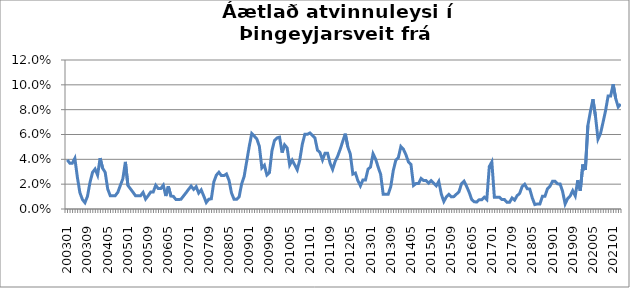
| Category | Series 0 |
|---|---|
| 200301 | 0.04 |
| 200302 | 0.037 |
| 200303 | 0.037 |
| 200304 | 0.041 |
| 200305 | 0.026 |
| 200306 | 0.013 |
| 200307 | 0.008 |
| 200308 | 0.005 |
| 200309 | 0.01 |
| 200310 | 0.021 |
| 200311 | 0.029 |
| 200312 | 0.032 |
| 200401 | 0.027 |
| 200402 | 0.041 |
| 200403 | 0.033 |
| 200404 | 0.03 |
| 200405 | 0.016 |
| 200406 | 0.011 |
| 200407 | 0.011 |
| 200408 | 0.011 |
| 200409 | 0.013 |
| 200410 | 0.019 |
| 200411 | 0.024 |
| 200412 | 0.038 |
| 200501 | 0.019 |
| 200502 | 0.016 |
| 200503 | 0.014 |
| 200504 | 0.011 |
| 200505 | 0.011 |
| 200506 | 0.011 |
| 200507 | 0.013 |
| 200508 | 0.008 |
| 200509 | 0.011 |
| 200510 | 0.014 |
| 200511 | 0.014 |
| 200512 | 0.019 |
| 200601 | 0.016 |
| 200602 | 0.016 |
| 200603 | 0.019 |
| 200604 | 0.01 |
| 200605 | 0.018 |
| 200606 | 0.01 |
| 200607 | 0.01 |
| 200608 | 0.008 |
| 200609 | 0.008 |
| 200610 | 0.008 |
| 200611 | 0.01 |
| 200612 | 0.013 |
| 200701 | 0.016 |
| 200702 | 0.018 |
| 200703 | 0.016 |
| 200704 | 0.018 |
| 200705 | 0.013 |
| 200706 | 0.015 |
| 200707 | 0.01 |
| 200708 | 0.005 |
| 200709 | 0.008 |
| 200710 | 0.008 |
| 200711 | 0.022 |
| 200712 | 0.027 |
| 200801 | 0.03 |
| 200802 | 0.027 |
| 200803 | 0.027 |
| 200804 | 0.028 |
| 200805 | 0.023 |
| 200806 | 0.013 |
| 200807 | 0.008 |
| 200808 | 0.008 |
| 200809 | 0.01 |
| 200810 | 0.02 |
| 200811 | 0.026 |
| 200812 | 0.038 |
| 200901 | 0.05 |
| 200902 | 0.061 |
| 200903 | 0.059 |
| 200904 | 0.056 |
| 200905 | 0.051 |
| 200906 | 0.033 |
| 200907 | 0.035 |
| 200908 | 0.027 |
| 200909 | 0.029 |
| 200910 | 0.047 |
| 200911 | 0.055 |
| 200912 | 0.057 |
| 201001 | 0.058 |
| 201002 | 0.045 |
| 201003 | 0.052 |
| 201004 | 0.049 |
| 201005 | 0.035 |
| 201006 | 0.039 |
| 201007 | 0.036 |
| 201008 | 0.032 |
| 201009 | 0.039 |
| 201010 | 0.052 |
| 201011 | 0.06 |
| 201012 | 0.06 |
| 201101 | 0.061 |
| 201102 | 0.059 |
| 201103 | 0.057 |
| 201104 | 0.047 |
| 201105 | 0.045 |
| 201106 | 0.04 |
| 201107 | 0.045 |
| 201108 | 0.045 |
| 201109 | 0.037 |
| 201110 | 0.032 |
| 201111 | 0.038 |
| 201112 | 0.043 |
| 201201 | 0.048 |
| 201202 | 0.054 |
| 201203 | 0.061 |
| 201204 | 0.05 |
| 201205 | 0.044 |
| 201206 | 0.028 |
| 201207 | 0.029 |
| 201208 | 0.023 |
| 201209 | 0.019 |
| 201210 | 0.023 |
| 201211 | 0.023 |
| 201212 | 0.032 |
| 201301 | 0.034 |
| 201302 | 0.044 |
| 201303 | 0.04 |
| 201304 | 0.034 |
| 201305 | 0.028 |
| 201306 | 0.012 |
| 201307 | 0.012 |
| 201308 | 0.012 |
| 201309 | 0.018 |
| 201310 | 0.031 |
| 201311 | 0.039 |
| 201312 | 0.041 |
| 201401 | 0.05 |
| 201402 | 0.048 |
| 201403 | 0.044 |
| 201404 | 0.038 |
| 201405 | 0.036 |
| 201406 | 0.019 |
| 201407 | 0.02 |
| 201408 | 0.02 |
| 201409 | 0.025 |
| 201410 | 0.023 |
| 201411 | 0.023 |
| 201412 | 0.021 |
| 201501 | 0.023 |
| 201502 | 0.021 |
| 201503 | 0.019 |
| 201504 | 0.022 |
| 201505 | 0.012 |
| 201506 | 0.006 |
| 201507 | 0.01 |
| 201508 | 0.012 |
| 201509 | 0.01 |
| 201510 | 0.01 |
| 201511 | 0.012 |
| 201512 | 0.014 |
| 201601 | 0.02 |
| 201602 | 0.022 |
| 201603 | 0.018 |
| 201604 | 0.014 |
| 201605 | 0.008 |
| 201606 | 0.006 |
| 201607 | 0.006 |
| 201608 | 0.008 |
| 201609 | 0.008 |
| 201610 | 0.01 |
| 201611 | 0.008 |
| 201612 | 0.034 |
| 201701 | 0.038 |
| 201702 | 0.009 |
| 201703 | 0.009 |
| 201704 | 0.009 |
| 201705 | 0.008 |
| 201706 | 0.008 |
| 201707 | 0.005 |
| 201708 | 0.005 |
| 201709 | 0.009 |
| 201710 | 0.007 |
| 201711 | 0.011 |
| 201712 | 0.013 |
| 201801 | 0.018 |
| 201802 | 0.02 |
| 201803 | 0.016 |
| 201804 | 0.016 |
| 201805 | 0.009 |
| 201806 | 0.004 |
| 201807 | 0.004 |
| 201808 | 0.004 |
| 201809 | 0.01 |
| 201810 | 0.01 |
| 201811 | 0.016 |
| 201812 | 0.018 |
| 201901 | 0.022 |
| 201902 | 0.022 |
| 201903 | 0.02 |
| 201904 | 0.02 |
| 201905 | 0.014 |
| 201906 | 0.004 |
| 201907 | 0.008 |
| 201908 | 0.011 |
| 201909 | 0.015 |
| 201910 | 0.011 |
| 201911 | 0.023 |
| 201912 | 0.015 |
| 202001 | 0.036 |
| 202002 | 0.031 |
| 202003 | 0.067 |
| 202004 | 0.078 |
| 202005 | 0.088 |
| 202006 | 0.075 |
| 202007 | 0.056 |
| 202008 | 0.061 |
| 202009 | 0.07 |
| 202010 | 0.079 |
| 202011 | 0.091 |
| 202012 | 0.091 |
| 202101 | 0.1 |
| 202102 | 0.089 |
| 202103 | 0.082 |
| 202104 | 0.084 |